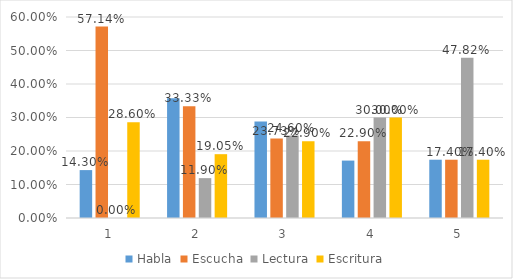
| Category | Habla | Escucha | Lectura | Escritura |
|---|---|---|---|---|
| 0 | 0.143 | 0.571 | 0 | 0.286 |
| 1 | 0.357 | 0.333 | 0.119 | 0.19 |
| 2 | 0.288 | 0.237 | 0.246 | 0.229 |
| 3 | 0.171 | 0.229 | 0.3 | 0.3 |
| 4 | 0.174 | 0.174 | 0.478 | 0.174 |